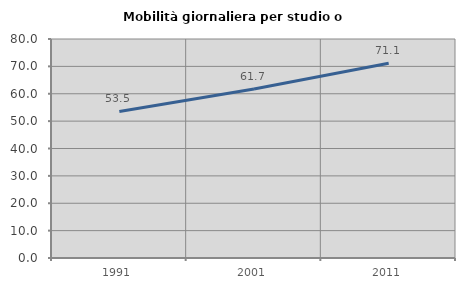
| Category | Mobilità giornaliera per studio o lavoro |
|---|---|
| 1991.0 | 53.525 |
| 2001.0 | 61.709 |
| 2011.0 | 71.122 |